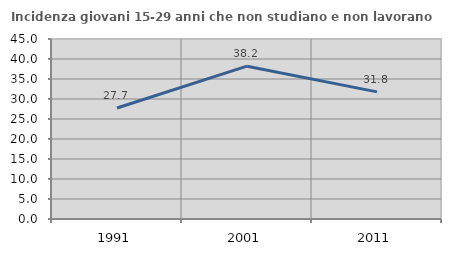
| Category | Incidenza giovani 15-29 anni che non studiano e non lavorano  |
|---|---|
| 1991.0 | 27.74 |
| 2001.0 | 38.21 |
| 2011.0 | 31.781 |